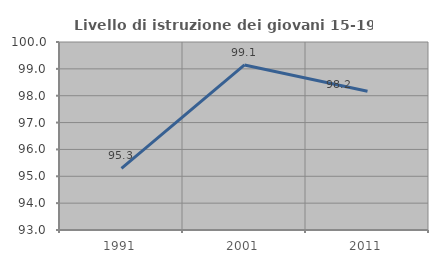
| Category | Livello di istruzione dei giovani 15-19 anni |
|---|---|
| 1991.0 | 95.297 |
| 2001.0 | 99.145 |
| 2011.0 | 98.168 |